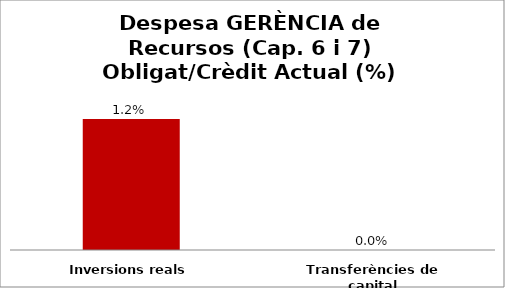
| Category | Series 0 |
|---|---|
| Inversions reals | 0.012 |
| Transferències de capital | 0 |